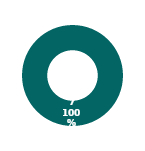
| Category | CPM |
|---|---|
| MIL 3 Complete | 7 |
| MIL 3 Not Complete | 0 |